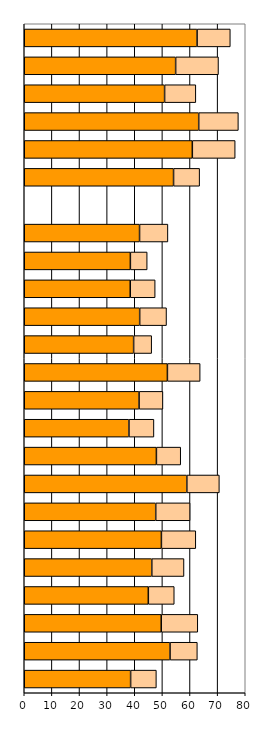
| Category | Series 0 | Series 1 |
|---|---|---|
| 0 | 38.505 | 9.321 |
| 1 | 52.772 | 9.882 |
| 2 | 49.587 | 13.231 |
| 3 | 44.912 | 9.392 |
| 4 | 46.166 | 11.659 |
| 5 | 49.648 | 12.456 |
| 6 | 47.592 | 12.447 |
| 7 | 58.855 | 11.771 |
| 8 | 47.834 | 8.812 |
| 9 | 37.901 | 9.045 |
| 10 | 41.565 | 8.638 |
| 11 | 51.82 | 11.852 |
| 12 | 39.595 | 6.533 |
| 13 | 41.783 | 9.717 |
| 14 | 38.366 | 9.023 |
| 15 | 38.415 | 6.084 |
| 16 | 41.741 | 10.261 |
| 17 | 0 | 0 |
| 18 | 54.048 | 9.441 |
| 19 | 60.839 | 15.517 |
| 20 | 63.155 | 14.353 |
| 21 | 50.805 | 11.31 |
| 22 | 54.805 | 15.507 |
| 23 | 62.565 | 12.026 |